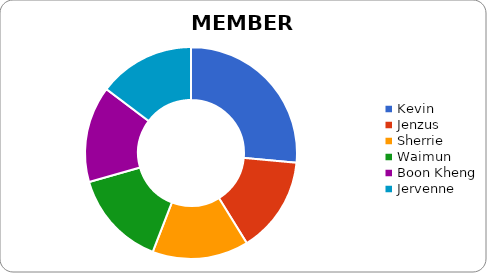
| Category | Series 0 |
|---|---|
| Kevin | 9 |
| Jenzus | 5 |
| Sherrie | 5 |
| Waimun | 5 |
| Boon Kheng | 5 |
| Jervenne | 5 |